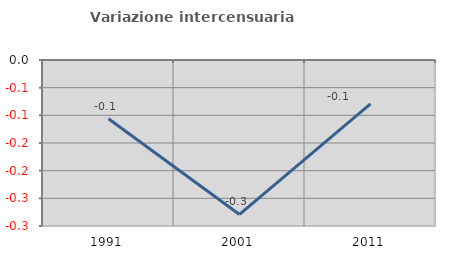
| Category | Variazione intercensuaria annua |
|---|---|
| 1991.0 | -0.106 |
| 2001.0 | -0.279 |
| 2011.0 | -0.079 |